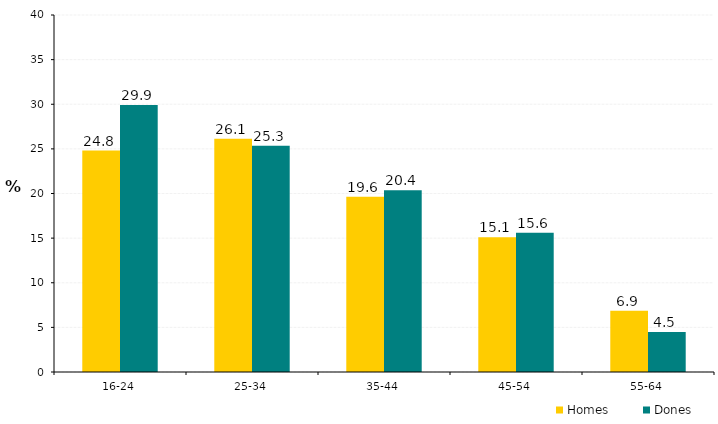
| Category | Homes | Dones |
|---|---|---|
| 16-24 | 24.815 | 29.927 |
| 25-34 | 26.127 | 25.337 |
| 35-44 | 19.649 | 20.356 |
| 45-54 | 15.094 | 15.597 |
| 55-64 | 6.856 | 4.489 |